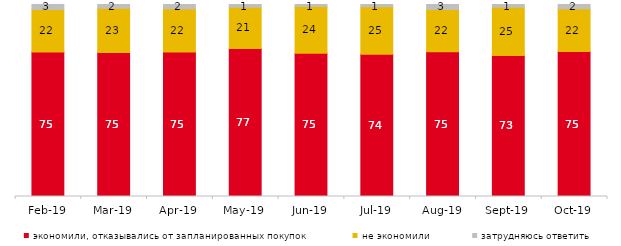
| Category | экономили, отказывались от запланированных покупок | не экономили | затрудняюсь ответить |
|---|---|---|---|
| 2019-02-01 | 75.2 | 22.2 | 2.6 |
| 2019-03-01 | 75.037 | 23.023 | 1.939 |
| 2019-04-01 | 75.297 | 22.426 | 2.277 |
| 2019-05-01 | 77.068 | 21.496 | 1.436 |
| 2019-06-01 | 74.663 | 24.239 | 1.097 |
| 2019-07-01 | 74.109 | 24.752 | 1.139 |
| 2019-08-01 | 75.425 | 21.978 | 2.597 |
| 2019-09-01 | 73.465 | 25.149 | 1.386 |
| 2019-10-01 | 75.495 | 22.327 | 2.178 |